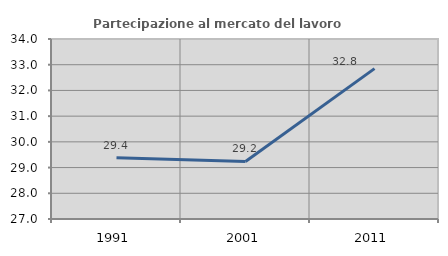
| Category | Partecipazione al mercato del lavoro  femminile |
|---|---|
| 1991.0 | 29.381 |
| 2001.0 | 29.238 |
| 2011.0 | 32.847 |